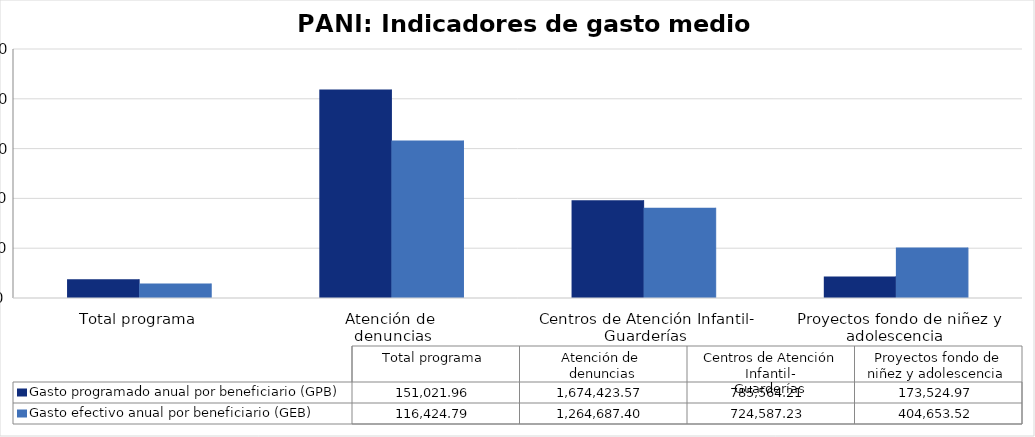
| Category | Gasto programado anual por beneficiario (GPB)  | Gasto efectivo anual por beneficiario (GEB)  |
|---|---|---|
| Total programa | 151021.961 | 116424.795 |
| Atención de 
denuncias | 1674423.574 | 1264687.401 |
| Centros de Atención Infantil-
Guarderías | 785564.213 | 724587.232 |
| Proyectos fondo de niñez y adolescencia  | 173524.972 | 404653.525 |